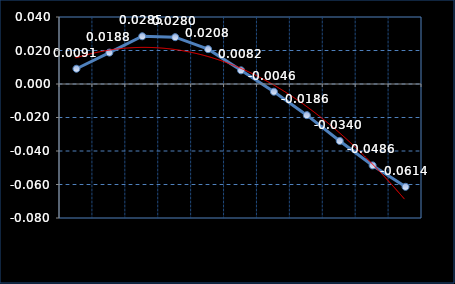
| Category | Series 0 |
|---|---|
| HOES1F | 0.009 |
| HOES2F | 0.019 |
| HOES3F | 0.028 |
| HOES4F | 0.028 |
| HOES5F | 0.021 |
| HOES6F | 0.008 |
| HOES7F | -0.005 |
| HOES8F | -0.019 |
| HOES9F | -0.034 |
| HOES10F | -0.049 |
| HOES11F | -0.061 |